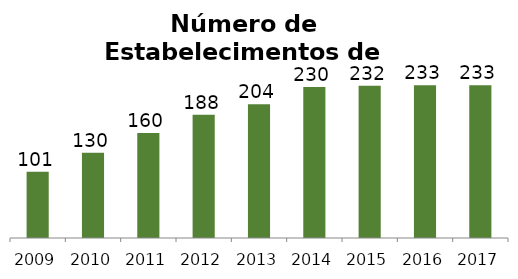
| Category | Eventos |
|---|---|
| 2009.0 | 101 |
| 2010.0 | 130 |
| 2011.0 | 160 |
| 2012.0 | 188 |
| 2013.0 | 204 |
| 2014.0 | 230 |
| 2015.0 | 232 |
| 2016.0 | 233 |
| 2017.0 | 233 |